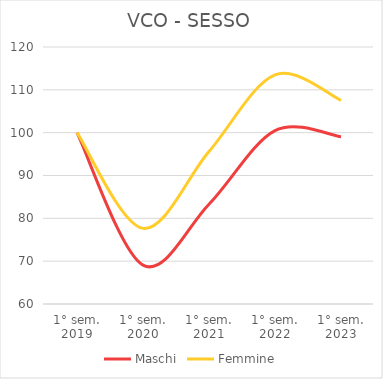
| Category | Maschi | Femmine |
|---|---|---|
| 1° sem.
2019 | 100 | 100 |
| 1° sem.
2020 | 69.072 | 77.653 |
| 1° sem.
2021 | 83.299 | 95.594 |
| 1° sem.
2022 | 100.481 | 113.489 |
| 1° sem.
2023 | 99.038 | 107.554 |